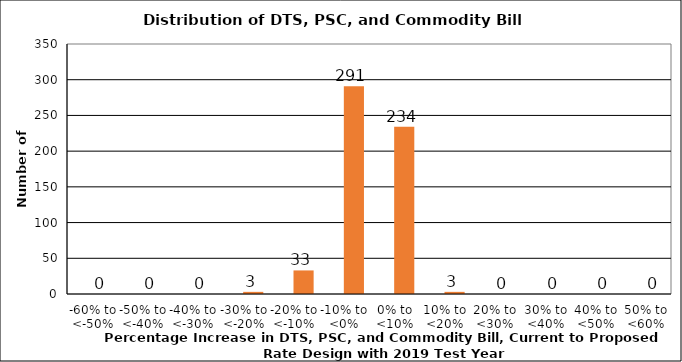
| Category | Series 0 | Series 1 |
|---|---|---|
| -60% to <-50% |  | 0 |
| -50% to <-40% |  | 0 |
| -40% to <-30% |  | 0 |
| -30% to <-20% |  | 3 |
| -20% to <-10% |  | 33 |
| -10% to <0% |  | 291 |
| 0% to <10% |  | 234 |
| 10% to <20% |  | 3 |
| 20% to <30% |  | 0 |
| 30% to <40% |  | 0 |
| 40% to <50% |  | 0 |
| 50% to <60% |  | 0 |